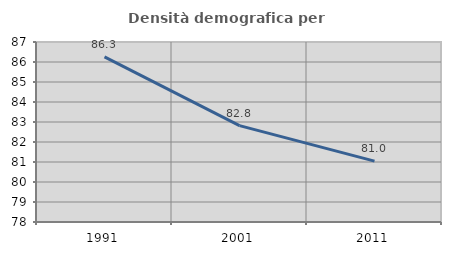
| Category | Densità demografica |
|---|---|
| 1991.0 | 86.256 |
| 2001.0 | 82.819 |
| 2011.0 | 81.044 |